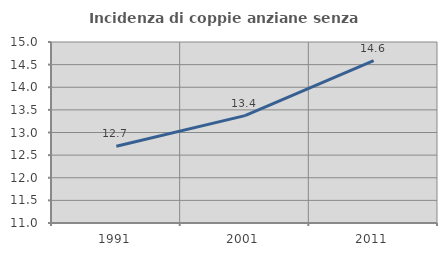
| Category | Incidenza di coppie anziane senza figli  |
|---|---|
| 1991.0 | 12.695 |
| 2001.0 | 13.373 |
| 2011.0 | 14.588 |